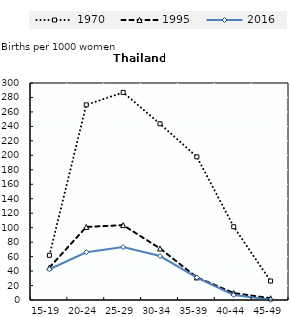
| Category | 1970 | 1995 | 2016 |
|---|---|---|---|
| 15-19 | 61.8 | 44.9 | 42.5 |
| 20-24 | 269.8 | 101 | 66 |
| 25-29 | 287 | 103.5 | 73.1 |
| 30-34 | 243.6 | 71.3 | 60.8 |
| 35-39 | 197.9 | 31.2 | 31 |
| 40-44 | 101.3 | 9.6 | 6.9 |
| 45-49 | 26.2 | 2.4 | 0.4 |